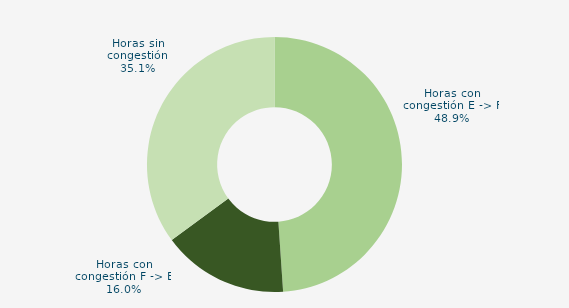
| Category | Horas con congestión E -> F |
|---|---|
| Horas con congestión E -> F | 48.925 |
| Horas con congestión F -> E | 15.995 |
| Horas sin congestión | 35.081 |